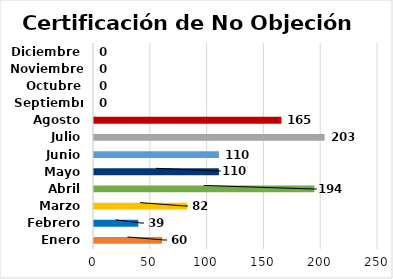
| Category | Certificación de No Objeción |
|---|---|
| Enero | 60 |
| Febrero | 39 |
| Marzo | 82 |
| Abril | 194 |
| Mayo | 110 |
| Junio | 110 |
| Julio | 203 |
| Agosto | 165 |
| Septiembre | 0 |
| Octubre | 0 |
| Noviembre | 0 |
| Diciembre | 0 |